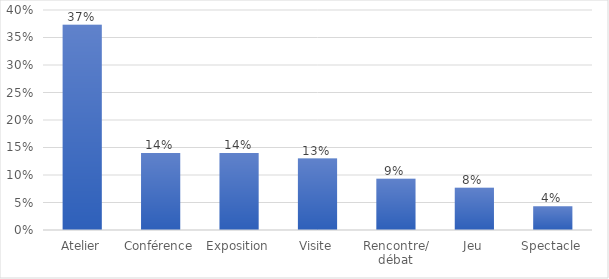
| Category | Series 0 |
|---|---|
| Atelier | 0.373 |
| Conférence | 0.14 |
| Exposition | 0.14 |
| Visite | 0.13 |
| Rencontre/ débat | 0.093 |
| Jeu | 0.077 |
| Spectacle | 0.043 |